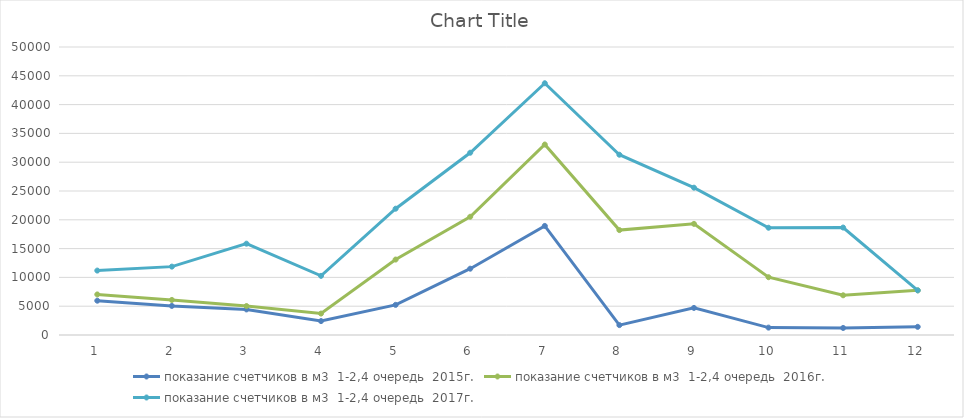
| Category | показание счетчиков в м3  |
|---|---|
| 0 | 4144 |
| 1 | 5784 |
| 2 | 10827 |
| 3 | 6543 |
| 4 | 8830 |
| 5 | 11117 |
| 6 | 10639 |
| 7 | 13084 |
| 8 | 6281 |
| 9 | 8589 |
| 10 | 11760 |
| 11 | 0 |